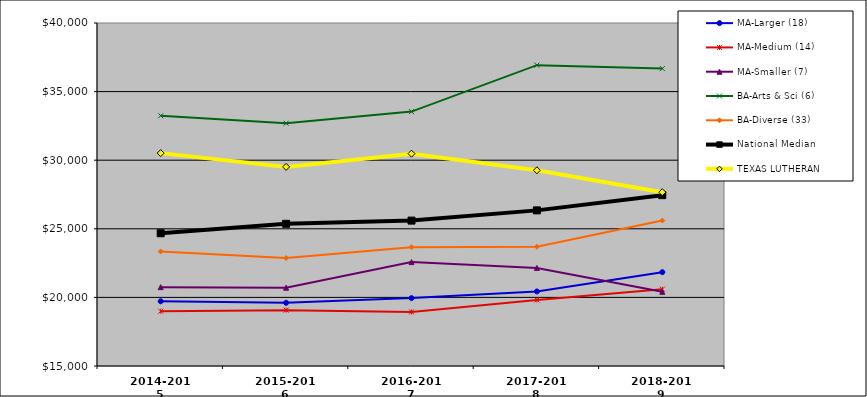
| Category | MA-Larger (18) | MA-Medium (14) | MA-Smaller (7) | BA-Arts & Sci (6) | BA-Diverse (33) | National Median | TEXAS LUTHERAN |
|---|---|---|---|---|---|---|---|
| 2014-2015 | 19718.057 | 18992.623 | 20747.49 | 33239.946 | 23345.933 | 24676.206 | 30515.957 |
| 2015-2016 | 19607.741 | 19071.762 | 20708.63 | 32692.996 | 22864.411 | 25364.205 | 29513.209 |
| 2016-2017 | 19947.359 | 18939.193 | 22572.244 | 33542.347 | 23658.611 | 25597.574 | 30475.146 |
| 2017-2018 | 20434.889 | 19811.5 | 22147.345 | 36927.09 | 23696.52 | 26342.841 | 29264.768 |
| 2018-2019 | 21841.13 | 20597.195 | 20407.4 | 36676.465 | 25601.245 | 27452.913 | 27668.054 |